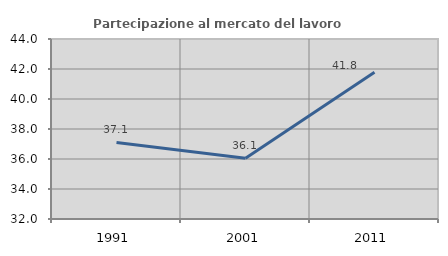
| Category | Partecipazione al mercato del lavoro  femminile |
|---|---|
| 1991.0 | 37.107 |
| 2001.0 | 36.054 |
| 2011.0 | 41.781 |